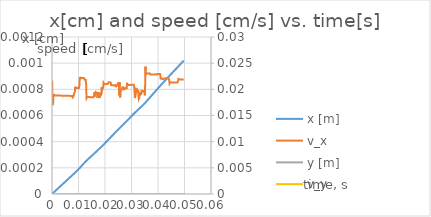
| Category | x [m] |
|---|---|
| 0.0 | 0 |
| 5e-05 | 0 |
| 0.0001 | 0 |
| 0.00015000000000000001 | 0 |
| 0.0002 | 0 |
| 0.00025 | 0 |
| 0.00030000000000000003 | 0 |
| 0.00035000000000000005 | 0 |
| 0.0004000000000000001 | 0 |
| 0.0004500000000000001 | 0 |
| 0.0005000000000000001 | 0 |
| 0.0005500000000000001 | 0 |
| 0.0006000000000000002 | 0 |
| 0.0006500000000000002 | 0 |
| 0.0007000000000000002 | 0 |
| 0.0007500000000000002 | 0 |
| 0.0008000000000000003 | 0 |
| 0.0008500000000000003 | 0 |
| 0.0009000000000000003 | 0 |
| 0.0009500000000000003 | 0 |
| 0.0010000000000000002 | 0 |
| 0.0010500000000000002 | 0 |
| 0.0011 | 0 |
| 0.00115 | 0 |
| 0.0012 | 0 |
| 0.0012499999999999998 | 0 |
| 0.0012999999999999997 | 0 |
| 0.0013499999999999996 | 0 |
| 0.0013999999999999996 | 0 |
| 0.0014499999999999995 | 0 |
| 0.0014999999999999994 | 0 |
| 0.0015499999999999993 | 0 |
| 0.0015999999999999992 | 0 |
| 0.0016499999999999991 | 0 |
| 0.001699999999999999 | 0 |
| 0.001749999999999999 | 0 |
| 0.0017999999999999989 | 0 |
| 0.0018499999999999988 | 0 |
| 0.0018999999999999987 | 0 |
| 0.0019499999999999986 | 0 |
| 0.0019999999999999987 | 0 |
| 0.002049999999999999 | 0 |
| 0.002099999999999999 | 0 |
| 0.002149999999999999 | 0 |
| 0.0021999999999999993 | 0 |
| 0.0022499999999999994 | 0 |
| 0.0022999999999999995 | 0 |
| 0.0023499999999999997 | 0 |
| 0.0024 | 0 |
| 0.00245 | 0 |
| 0.0025 | 0 |
| 0.00255 | 0 |
| 0.0026000000000000003 | 0 |
| 0.0026500000000000004 | 0 |
| 0.0027000000000000006 | 0 |
| 0.0027500000000000007 | 0 |
| 0.002800000000000001 | 0 |
| 0.002850000000000001 | 0 |
| 0.002900000000000001 | 0 |
| 0.0029500000000000012 | 0 |
| 0.0030000000000000014 | 0 |
| 0.0030500000000000015 | 0 |
| 0.0031000000000000016 | 0 |
| 0.0031500000000000018 | 0 |
| 0.003200000000000002 | 0 |
| 0.003250000000000002 | 0 |
| 0.003300000000000002 | 0 |
| 0.0033500000000000023 | 0 |
| 0.0034000000000000024 | 0 |
| 0.0034500000000000025 | 0 |
| 0.0035000000000000027 | 0 |
| 0.003550000000000003 | 0 |
| 0.003600000000000003 | 0 |
| 0.003650000000000003 | 0 |
| 0.003700000000000003 | 0 |
| 0.0037500000000000033 | 0 |
| 0.0038000000000000035 | 0 |
| 0.0038500000000000036 | 0 |
| 0.0039000000000000037 | 0 |
| 0.003950000000000004 | 0 |
| 0.0040000000000000036 | 0 |
| 0.004050000000000003 | 0 |
| 0.004100000000000003 | 0 |
| 0.004150000000000003 | 0 |
| 0.004200000000000002 | 0 |
| 0.004250000000000002 | 0 |
| 0.004300000000000002 | 0 |
| 0.0043500000000000014 | 0 |
| 0.004400000000000001 | 0 |
| 0.004450000000000001 | 0 |
| 0.0045000000000000005 | 0 |
| 0.00455 | 0 |
| 0.0046 | 0 |
| 0.00465 | 0 |
| 0.004699999999999999 | 0 |
| 0.004749999999999999 | 0 |
| 0.004799999999999999 | 0 |
| 0.004849999999999998 | 0 |
| 0.004899999999999998 | 0 |
| 0.004949999999999998 | 0 |
| 0.0049999999999999975 | 0 |
| 0.005049999999999997 | 0 |
| 0.005099999999999997 | 0 |
| 0.005149999999999997 | 0 |
| 0.005199999999999996 | 0 |
| 0.005249999999999996 | 0 |
| 0.005299999999999996 | 0 |
| 0.005349999999999995 | 0 |
| 0.005399999999999995 | 0 |
| 0.005449999999999995 | 0 |
| 0.0054999999999999945 | 0 |
| 0.005549999999999994 | 0 |
| 0.005599999999999994 | 0 |
| 0.005649999999999994 | 0 |
| 0.005699999999999993 | 0 |
| 0.005749999999999993 | 0 |
| 0.005799999999999993 | 0 |
| 0.005849999999999992 | 0 |
| 0.005899999999999992 | 0 |
| 0.005949999999999992 | 0 |
| 0.0059999999999999915 | 0 |
| 0.006049999999999991 | 0 |
| 0.006099999999999991 | 0 |
| 0.0061499999999999905 | 0 |
| 0.00619999999999999 | 0 |
| 0.00624999999999999 | 0 |
| 0.00629999999999999 | 0 |
| 0.006349999999999989 | 0 |
| 0.006399999999999989 | 0 |
| 0.006449999999999989 | 0 |
| 0.006499999999999988 | 0 |
| 0.006549999999999988 | 0 |
| 0.006599999999999988 | 0 |
| 0.0066499999999999875 | 0 |
| 0.006699999999999987 | 0 |
| 0.006749999999999987 | 0 |
| 0.006799999999999987 | 0 |
| 0.006849999999999986 | 0 |
| 0.006899999999999986 | 0 |
| 0.006949999999999986 | 0 |
| 0.006999999999999985 | 0 |
| 0.007049999999999985 | 0 |
| 0.007099999999999985 | 0 |
| 0.0071499999999999845 | 0 |
| 0.007199999999999984 | 0 |
| 0.007249999999999984 | 0 |
| 0.007299999999999984 | 0 |
| 0.007349999999999983 | 0 |
| 0.007399999999999983 | 0 |
| 0.007449999999999983 | 0 |
| 0.007499999999999982 | 0 |
| 0.007549999999999982 | 0 |
| 0.007599999999999982 | 0 |
| 0.0076499999999999815 | 0 |
| 0.007699999999999981 | 0 |
| 0.007749999999999981 | 0 |
| 0.0077999999999999806 | 0 |
| 0.00784999999999998 | 0 |
| 0.00789999999999998 | 0 |
| 0.00794999999999998 | 0 |
| 0.00799999999999998 | 0 |
| 0.008049999999999979 | 0 |
| 0.008099999999999979 | 0 |
| 0.008149999999999978 | 0 |
| 0.008199999999999978 | 0 |
| 0.008249999999999978 | 0 |
| 0.008299999999999978 | 0 |
| 0.008349999999999977 | 0 |
| 0.008399999999999977 | 0 |
| 0.008449999999999977 | 0 |
| 0.008499999999999976 | 0 |
| 0.008549999999999976 | 0 |
| 0.008599999999999976 | 0 |
| 0.008649999999999975 | 0 |
| 0.008699999999999975 | 0 |
| 0.008749999999999975 | 0 |
| 0.008799999999999975 | 0 |
| 0.008849999999999974 | 0 |
| 0.008899999999999974 | 0 |
| 0.008949999999999974 | 0 |
| 0.008999999999999973 | 0 |
| 0.009049999999999973 | 0 |
| 0.009099999999999973 | 0 |
| 0.009149999999999972 | 0 |
| 0.009199999999999972 | 0 |
| 0.009249999999999972 | 0 |
| 0.009299999999999971 | 0 |
| 0.009349999999999971 | 0 |
| 0.009399999999999971 | 0 |
| 0.00944999999999997 | 0 |
| 0.00949999999999997 | 0 |
| 0.00954999999999997 | 0 |
| 0.00959999999999997 | 0 |
| 0.00964999999999997 | 0 |
| 0.009699999999999969 | 0 |
| 0.009749999999999969 | 0 |
| 0.009799999999999968 | 0 |
| 0.009849999999999968 | 0 |
| 0.009899999999999968 | 0 |
| 0.009949999999999968 | 0 |
| 0.009999999999999967 | 0 |
| 0.010049999999999967 | 0 |
| 0.010099999999999967 | 0 |
| 0.010149999999999966 | 0 |
| 0.010199999999999966 | 0 |
| 0.010249999999999966 | 0 |
| 0.010299999999999965 | 0 |
| 0.010349999999999965 | 0 |
| 0.010399999999999965 | 0 |
| 0.010449999999999965 | 0 |
| 0.010499999999999964 | 0 |
| 0.010549999999999964 | 0 |
| 0.010599999999999964 | 0 |
| 0.010649999999999963 | 0 |
| 0.010699999999999963 | 0 |
| 0.010749999999999963 | 0 |
| 0.010799999999999962 | 0 |
| 0.010849999999999962 | 0 |
| 0.010899999999999962 | 0 |
| 0.010949999999999962 | 0 |
| 0.010999999999999961 | 0 |
| 0.011049999999999961 | 0 |
| 0.01109999999999996 | 0 |
| 0.01114999999999996 | 0 |
| 0.01119999999999996 | 0 |
| 0.01124999999999996 | 0 |
| 0.01129999999999996 | 0 |
| 0.011349999999999959 | 0 |
| 0.011399999999999959 | 0 |
| 0.011449999999999958 | 0 |
| 0.011499999999999958 | 0 |
| 0.011549999999999958 | 0 |
| 0.011599999999999958 | 0 |
| 0.011649999999999957 | 0 |
| 0.011699999999999957 | 0 |
| 0.011749999999999957 | 0 |
| 0.011799999999999956 | 0 |
| 0.011849999999999956 | 0 |
| 0.011899999999999956 | 0 |
| 0.011949999999999955 | 0 |
| 0.011999999999999955 | 0 |
| 0.012049999999999955 | 0 |
| 0.012099999999999955 | 0 |
| 0.012149999999999954 | 0 |
| 0.012199999999999954 | 0 |
| 0.012249999999999954 | 0 |
| 0.012299999999999953 | 0 |
| 0.012349999999999953 | 0 |
| 0.012399999999999953 | 0 |
| 0.012449999999999952 | 0 |
| 0.012499999999999952 | 0 |
| 0.012549999999999952 | 0 |
| 0.012599999999999952 | 0 |
| 0.012649999999999951 | 0 |
| 0.012699999999999951 | 0 |
| 0.01274999999999995 | 0 |
| 0.01279999999999995 | 0 |
| 0.01284999999999995 | 0 |
| 0.01289999999999995 | 0 |
| 0.01294999999999995 | 0 |
| 0.012999999999999949 | 0 |
| 0.013049999999999949 | 0 |
| 0.013099999999999948 | 0 |
| 0.013149999999999948 | 0 |
| 0.013199999999999948 | 0 |
| 0.013249999999999948 | 0 |
| 0.013299999999999947 | 0 |
| 0.013349999999999947 | 0 |
| 0.013399999999999947 | 0 |
| 0.013449999999999946 | 0 |
| 0.013499999999999946 | 0 |
| 0.013549999999999946 | 0 |
| 0.013599999999999945 | 0 |
| 0.013649999999999945 | 0 |
| 0.013699999999999945 | 0 |
| 0.013749999999999945 | 0 |
| 0.013799999999999944 | 0 |
| 0.013849999999999944 | 0 |
| 0.013899999999999944 | 0 |
| 0.013949999999999943 | 0 |
| 0.013999999999999943 | 0 |
| 0.014049999999999943 | 0 |
| 0.014099999999999942 | 0 |
| 0.014149999999999942 | 0 |
| 0.014199999999999942 | 0 |
| 0.014249999999999942 | 0 |
| 0.014299999999999941 | 0 |
| 0.014349999999999941 | 0 |
| 0.01439999999999994 | 0 |
| 0.01444999999999994 | 0 |
| 0.01449999999999994 | 0 |
| 0.01454999999999994 | 0 |
| 0.01459999999999994 | 0 |
| 0.014649999999999939 | 0 |
| 0.014699999999999939 | 0 |
| 0.014749999999999939 | 0 |
| 0.014799999999999938 | 0 |
| 0.014849999999999938 | 0 |
| 0.014899999999999938 | 0 |
| 0.014949999999999937 | 0 |
| 0.014999999999999937 | 0 |
| 0.015049999999999937 | 0 |
| 0.015099999999999936 | 0 |
| 0.015149999999999936 | 0 |
| 0.015199999999999936 | 0 |
| 0.015249999999999935 | 0 |
| 0.015299999999999935 | 0 |
| 0.015349999999999935 | 0 |
| 0.015399999999999935 | 0 |
| 0.015449999999999934 | 0 |
| 0.015499999999999934 | 0 |
| 0.015549999999999934 | 0 |
| 0.015599999999999933 | 0 |
| 0.015649999999999935 | 0 |
| 0.015699999999999936 | 0 |
| 0.015749999999999938 | 0 |
| 0.01579999999999994 | 0 |
| 0.01584999999999994 | 0 |
| 0.015899999999999942 | 0 |
| 0.015949999999999943 | 0 |
| 0.015999999999999945 | 0 |
| 0.016049999999999946 | 0 |
| 0.016099999999999948 | 0 |
| 0.01614999999999995 | 0 |
| 0.01619999999999995 | 0 |
| 0.016249999999999952 | 0 |
| 0.016299999999999953 | 0 |
| 0.016349999999999955 | 0 |
| 0.016399999999999956 | 0 |
| 0.016449999999999958 | 0 |
| 0.01649999999999996 | 0 |
| 0.01654999999999996 | 0 |
| 0.016599999999999962 | 0 |
| 0.016649999999999963 | 0 |
| 0.016699999999999965 | 0 |
| 0.016749999999999966 | 0 |
| 0.016799999999999968 | 0 |
| 0.01684999999999997 | 0 |
| 0.01689999999999997 | 0 |
| 0.016949999999999972 | 0 |
| 0.016999999999999973 | 0 |
| 0.017049999999999975 | 0 |
| 0.017099999999999976 | 0 |
| 0.017149999999999978 | 0 |
| 0.01719999999999998 | 0 |
| 0.01724999999999998 | 0 |
| 0.017299999999999982 | 0 |
| 0.017349999999999983 | 0 |
| 0.017399999999999985 | 0 |
| 0.017449999999999986 | 0 |
| 0.017499999999999988 | 0 |
| 0.01754999999999999 | 0 |
| 0.01759999999999999 | 0 |
| 0.017649999999999992 | 0 |
| 0.017699999999999994 | 0 |
| 0.017749999999999995 | 0 |
| 0.017799999999999996 | 0 |
| 0.017849999999999998 | 0 |
| 0.0179 | 0 |
| 0.01795 | 0 |
| 0.018000000000000002 | 0 |
| 0.018050000000000004 | 0 |
| 0.018100000000000005 | 0 |
| 0.018150000000000006 | 0 |
| 0.018200000000000008 | 0 |
| 0.01825000000000001 | 0 |
| 0.01830000000000001 | 0 |
| 0.018350000000000012 | 0 |
| 0.018400000000000014 | 0 |
| 0.018450000000000015 | 0 |
| 0.018500000000000016 | 0 |
| 0.018550000000000018 | 0 |
| 0.01860000000000002 | 0 |
| 0.01865000000000002 | 0 |
| 0.018700000000000022 | 0 |
| 0.018750000000000024 | 0 |
| 0.018800000000000025 | 0 |
| 0.018850000000000026 | 0 |
| 0.018900000000000028 | 0 |
| 0.01895000000000003 | 0 |
| 0.01900000000000003 | 0 |
| 0.019050000000000032 | 0 |
| 0.019100000000000034 | 0 |
| 0.019150000000000035 | 0 |
| 0.019200000000000036 | 0 |
| 0.019250000000000038 | 0 |
| 0.01930000000000004 | 0 |
| 0.01935000000000004 | 0 |
| 0.019400000000000042 | 0 |
| 0.019450000000000044 | 0 |
| 0.019500000000000045 | 0 |
| 0.019550000000000047 | 0 |
| 0.019600000000000048 | 0 |
| 0.01965000000000005 | 0 |
| 0.01970000000000005 | 0 |
| 0.019750000000000052 | 0 |
| 0.019800000000000054 | 0 |
| 0.019850000000000055 | 0 |
| 0.019900000000000057 | 0 |
| 0.019950000000000058 | 0 |
| 0.02000000000000006 | 0 |
| 0.02005000000000006 | 0 |
| 0.020100000000000062 | 0 |
| 0.020150000000000064 | 0 |
| 0.020200000000000065 | 0 |
| 0.020250000000000067 | 0 |
| 0.020300000000000068 | 0 |
| 0.02035000000000007 | 0 |
| 0.02040000000000007 | 0 |
| 0.020450000000000072 | 0 |
| 0.020500000000000074 | 0 |
| 0.020550000000000075 | 0 |
| 0.020600000000000077 | 0 |
| 0.020650000000000078 | 0 |
| 0.02070000000000008 | 0 |
| 0.02075000000000008 | 0 |
| 0.020800000000000082 | 0 |
| 0.020850000000000084 | 0 |
| 0.020900000000000085 | 0 |
| 0.020950000000000087 | 0 |
| 0.021000000000000088 | 0 |
| 0.02105000000000009 | 0 |
| 0.02110000000000009 | 0 |
| 0.021150000000000092 | 0 |
| 0.021200000000000094 | 0 |
| 0.021250000000000095 | 0 |
| 0.021300000000000097 | 0 |
| 0.021350000000000098 | 0 |
| 0.0214000000000001 | 0 |
| 0.0214500000000001 | 0 |
| 0.021500000000000102 | 0 |
| 0.021550000000000104 | 0 |
| 0.021600000000000105 | 0 |
| 0.021650000000000107 | 0 |
| 0.021700000000000108 | 0 |
| 0.02175000000000011 | 0 |
| 0.02180000000000011 | 0 |
| 0.021850000000000112 | 0 |
| 0.021900000000000114 | 0 |
| 0.021950000000000115 | 0 |
| 0.022000000000000117 | 0 |
| 0.022050000000000118 | 0 |
| 0.02210000000000012 | 0 |
| 0.02215000000000012 | 0 |
| 0.022200000000000122 | 0 |
| 0.022250000000000124 | 0 |
| 0.022300000000000125 | 0 |
| 0.022350000000000127 | 0 |
| 0.022400000000000128 | 0 |
| 0.02245000000000013 | 0 |
| 0.02250000000000013 | 0 |
| 0.022550000000000132 | 0 |
| 0.022600000000000134 | 0 |
| 0.022650000000000135 | 0 |
| 0.022700000000000137 | 0 |
| 0.022750000000000138 | 0 |
| 0.02280000000000014 | 0 |
| 0.02285000000000014 | 0 |
| 0.022900000000000142 | 0 |
| 0.022950000000000144 | 0 |
| 0.023000000000000145 | 0 |
| 0.023050000000000147 | 0 |
| 0.023100000000000148 | 0 |
| 0.02315000000000015 | 0 |
| 0.02320000000000015 | 0 |
| 0.023250000000000152 | 0 |
| 0.023300000000000154 | 0 |
| 0.023350000000000155 | 0 |
| 0.023400000000000157 | 0 |
| 0.023450000000000158 | 0 |
| 0.02350000000000016 | 0 |
| 0.02355000000000016 | 0 |
| 0.023600000000000163 | 0 |
| 0.023650000000000164 | 0 |
| 0.023700000000000165 | 0 |
| 0.023750000000000167 | 0 |
| 0.023800000000000168 | 0 |
| 0.02385000000000017 | 0 |
| 0.02390000000000017 | 0 |
| 0.023950000000000173 | 0 |
| 0.024000000000000174 | 0 |
| 0.024050000000000175 | 0 |
| 0.024100000000000177 | 0 |
| 0.02415000000000018 | 0 |
| 0.02420000000000018 | 0 |
| 0.02425000000000018 | 0 |
| 0.024300000000000183 | 0 |
| 0.024350000000000184 | 0 |
| 0.024400000000000185 | 0 |
| 0.024450000000000187 | 0 |
| 0.02450000000000019 | 0 |
| 0.02455000000000019 | 0 |
| 0.02460000000000019 | 0 |
| 0.024650000000000193 | 0 |
| 0.024700000000000194 | 0 |
| 0.024750000000000195 | 0 |
| 0.024800000000000197 | 0 |
| 0.0248500000000002 | 0 |
| 0.0249000000000002 | 0 |
| 0.0249500000000002 | 0 |
| 0.025000000000000203 | 0 |
| 0.025050000000000204 | 0 |
| 0.025100000000000205 | 0 |
| 0.025150000000000207 | 0 |
| 0.02520000000000021 | 0 |
| 0.02525000000000021 | 0 |
| 0.02530000000000021 | 0 |
| 0.025350000000000213 | 0.001 |
| 0.025400000000000214 | 0.001 |
| 0.025450000000000216 | 0.001 |
| 0.025500000000000217 | 0.001 |
| 0.02555000000000022 | 0.001 |
| 0.02560000000000022 | 0.001 |
| 0.02565000000000022 | 0.001 |
| 0.025700000000000223 | 0.001 |
| 0.025750000000000224 | 0.001 |
| 0.025800000000000226 | 0.001 |
| 0.025850000000000227 | 0.001 |
| 0.02590000000000023 | 0.001 |
| 0.02595000000000023 | 0.001 |
| 0.02600000000000023 | 0.001 |
| 0.026050000000000233 | 0.001 |
| 0.026100000000000234 | 0.001 |
| 0.026150000000000236 | 0.001 |
| 0.026200000000000237 | 0.001 |
| 0.02625000000000024 | 0.001 |
| 0.02630000000000024 | 0.001 |
| 0.02635000000000024 | 0.001 |
| 0.026400000000000243 | 0.001 |
| 0.026450000000000244 | 0.001 |
| 0.026500000000000246 | 0.001 |
| 0.026550000000000247 | 0.001 |
| 0.02660000000000025 | 0.001 |
| 0.02665000000000025 | 0.001 |
| 0.02670000000000025 | 0.001 |
| 0.026750000000000253 | 0.001 |
| 0.026800000000000254 | 0.001 |
| 0.026850000000000256 | 0.001 |
| 0.026900000000000257 | 0.001 |
| 0.02695000000000026 | 0.001 |
| 0.02700000000000026 | 0.001 |
| 0.02705000000000026 | 0.001 |
| 0.027100000000000263 | 0.001 |
| 0.027150000000000264 | 0.001 |
| 0.027200000000000266 | 0.001 |
| 0.027250000000000267 | 0.001 |
| 0.02730000000000027 | 0.001 |
| 0.02735000000000027 | 0.001 |
| 0.02740000000000027 | 0.001 |
| 0.027450000000000273 | 0.001 |
| 0.027500000000000274 | 0.001 |
| 0.027550000000000276 | 0.001 |
| 0.027600000000000277 | 0.001 |
| 0.02765000000000028 | 0.001 |
| 0.02770000000000028 | 0.001 |
| 0.02775000000000028 | 0.001 |
| 0.027800000000000283 | 0.001 |
| 0.027850000000000284 | 0.001 |
| 0.027900000000000286 | 0.001 |
| 0.027950000000000287 | 0.001 |
| 0.02800000000000029 | 0.001 |
| 0.02805000000000029 | 0.001 |
| 0.02810000000000029 | 0.001 |
| 0.028150000000000293 | 0.001 |
| 0.028200000000000294 | 0.001 |
| 0.028250000000000296 | 0.001 |
| 0.028300000000000297 | 0.001 |
| 0.0283500000000003 | 0.001 |
| 0.0284000000000003 | 0.001 |
| 0.0284500000000003 | 0.001 |
| 0.028500000000000303 | 0.001 |
| 0.028550000000000304 | 0.001 |
| 0.028600000000000306 | 0.001 |
| 0.028650000000000307 | 0.001 |
| 0.02870000000000031 | 0.001 |
| 0.02875000000000031 | 0.001 |
| 0.02880000000000031 | 0.001 |
| 0.028850000000000313 | 0.001 |
| 0.028900000000000314 | 0.001 |
| 0.028950000000000316 | 0.001 |
| 0.029000000000000317 | 0.001 |
| 0.02905000000000032 | 0.001 |
| 0.02910000000000032 | 0.001 |
| 0.02915000000000032 | 0.001 |
| 0.029200000000000323 | 0.001 |
| 0.029250000000000324 | 0.001 |
| 0.029300000000000326 | 0.001 |
| 0.029350000000000327 | 0.001 |
| 0.02940000000000033 | 0.001 |
| 0.02945000000000033 | 0.001 |
| 0.02950000000000033 | 0.001 |
| 0.029550000000000333 | 0.001 |
| 0.029600000000000334 | 0.001 |
| 0.029650000000000336 | 0.001 |
| 0.029700000000000337 | 0.001 |
| 0.02975000000000034 | 0.001 |
| 0.02980000000000034 | 0.001 |
| 0.02985000000000034 | 0.001 |
| 0.029900000000000343 | 0.001 |
| 0.029950000000000344 | 0.001 |
| 0.030000000000000346 | 0.001 |
| 0.030050000000000347 | 0.001 |
| 0.03010000000000035 | 0.001 |
| 0.03015000000000035 | 0.001 |
| 0.03020000000000035 | 0.001 |
| 0.030250000000000353 | 0.001 |
| 0.030300000000000354 | 0.001 |
| 0.030350000000000356 | 0.001 |
| 0.030400000000000357 | 0.001 |
| 0.03045000000000036 | 0.001 |
| 0.03050000000000036 | 0.001 |
| 0.03055000000000036 | 0.001 |
| 0.030600000000000363 | 0.001 |
| 0.030650000000000364 | 0.001 |
| 0.030700000000000366 | 0.001 |
| 0.030750000000000367 | 0.001 |
| 0.03080000000000037 | 0.001 |
| 0.03085000000000037 | 0.001 |
| 0.03090000000000037 | 0.001 |
| 0.030950000000000373 | 0.001 |
| 0.031000000000000374 | 0.001 |
| 0.031050000000000376 | 0.001 |
| 0.031100000000000377 | 0.001 |
| 0.03115000000000038 | 0.001 |
| 0.03120000000000038 | 0.001 |
| 0.03125000000000038 | 0.001 |
| 0.03130000000000038 | 0.001 |
| 0.031350000000000385 | 0.001 |
| 0.031400000000000386 | 0.001 |
| 0.03145000000000039 | 0.001 |
| 0.03150000000000039 | 0.001 |
| 0.03155000000000039 | 0.001 |
| 0.03160000000000039 | 0.001 |
| 0.03165000000000039 | 0.001 |
| 0.031700000000000395 | 0.001 |
| 0.031750000000000396 | 0.001 |
| 0.0318000000000004 | 0.001 |
| 0.0318500000000004 | 0.001 |
| 0.0319000000000004 | 0.001 |
| 0.0319500000000004 | 0.001 |
| 0.0320000000000004 | 0.001 |
| 0.032050000000000405 | 0.001 |
| 0.032100000000000406 | 0.001 |
| 0.03215000000000041 | 0.001 |
| 0.03220000000000041 | 0.001 |
| 0.03225000000000041 | 0.001 |
| 0.03230000000000041 | 0.001 |
| 0.03235000000000041 | 0.001 |
| 0.032400000000000415 | 0.001 |
| 0.032450000000000416 | 0.001 |
| 0.03250000000000042 | 0.001 |
| 0.03255000000000042 | 0.001 |
| 0.03260000000000042 | 0.001 |
| 0.03265000000000042 | 0.001 |
| 0.03270000000000042 | 0.001 |
| 0.032750000000000425 | 0.001 |
| 0.032800000000000426 | 0.001 |
| 0.03285000000000043 | 0.001 |
| 0.03290000000000043 | 0.001 |
| 0.03295000000000043 | 0.001 |
| 0.03300000000000043 | 0.001 |
| 0.03305000000000043 | 0.001 |
| 0.033100000000000435 | 0.001 |
| 0.033150000000000436 | 0.001 |
| 0.03320000000000044 | 0.001 |
| 0.03325000000000044 | 0.001 |
| 0.03330000000000044 | 0.001 |
| 0.03335000000000044 | 0.001 |
| 0.03340000000000044 | 0.001 |
| 0.033450000000000445 | 0.001 |
| 0.033500000000000446 | 0.001 |
| 0.03355000000000045 | 0.001 |
| 0.03360000000000045 | 0.001 |
| 0.03365000000000045 | 0.001 |
| 0.03370000000000045 | 0.001 |
| 0.03375000000000045 | 0.001 |
| 0.033800000000000455 | 0.001 |
| 0.033850000000000456 | 0.001 |
| 0.03390000000000046 | 0.001 |
| 0.03395000000000046 | 0.001 |
| 0.03400000000000046 | 0.001 |
| 0.03405000000000046 | 0.001 |
| 0.03410000000000046 | 0.001 |
| 0.034150000000000465 | 0.001 |
| 0.034200000000000466 | 0.001 |
| 0.03425000000000047 | 0.001 |
| 0.03430000000000047 | 0.001 |
| 0.03435000000000047 | 0.001 |
| 0.03440000000000047 | 0.001 |
| 0.03445000000000047 | 0.001 |
| 0.034500000000000475 | 0.001 |
| 0.034550000000000476 | 0.001 |
| 0.03460000000000048 | 0.001 |
| 0.03465000000000048 | 0.001 |
| 0.03470000000000048 | 0.001 |
| 0.03475000000000048 | 0.001 |
| 0.03480000000000048 | 0.001 |
| 0.034850000000000485 | 0.001 |
| 0.034900000000000486 | 0.001 |
| 0.03495000000000049 | 0.001 |
| 0.03500000000000049 | 0.001 |
| 0.03505000000000049 | 0.001 |
| 0.03510000000000049 | 0.001 |
| 0.03515000000000049 | 0.001 |
| 0.035200000000000495 | 0.001 |
| 0.035250000000000496 | 0.001 |
| 0.0353000000000005 | 0.001 |
| 0.0353500000000005 | 0.001 |
| 0.0354000000000005 | 0.001 |
| 0.0354500000000005 | 0.001 |
| 0.0355000000000005 | 0.001 |
| 0.035550000000000505 | 0.001 |
| 0.035600000000000506 | 0.001 |
| 0.03565000000000051 | 0.001 |
| 0.03570000000000051 | 0.001 |
| 0.03575000000000051 | 0.001 |
| 0.03580000000000051 | 0.001 |
| 0.03585000000000051 | 0.001 |
| 0.035900000000000515 | 0.001 |
| 0.035950000000000516 | 0.001 |
| 0.03600000000000052 | 0.001 |
| 0.03605000000000052 | 0.001 |
| 0.03610000000000052 | 0.001 |
| 0.03615000000000052 | 0.001 |
| 0.03620000000000052 | 0.001 |
| 0.036250000000000525 | 0.001 |
| 0.036300000000000526 | 0.001 |
| 0.03635000000000053 | 0.001 |
| 0.03640000000000053 | 0.001 |
| 0.03645000000000053 | 0.001 |
| 0.03650000000000053 | 0.001 |
| 0.03655000000000053 | 0.001 |
| 0.036600000000000535 | 0.001 |
| 0.036650000000000536 | 0.001 |
| 0.03670000000000054 | 0.001 |
| 0.03675000000000054 | 0.001 |
| 0.03680000000000054 | 0.001 |
| 0.03685000000000054 | 0.001 |
| 0.036900000000000543 | 0.001 |
| 0.036950000000000545 | 0.001 |
| 0.037000000000000546 | 0.001 |
| 0.03705000000000055 | 0.001 |
| 0.03710000000000055 | 0.001 |
| 0.03715000000000055 | 0.001 |
| 0.03720000000000055 | 0.001 |
| 0.037250000000000554 | 0.001 |
| 0.037300000000000555 | 0.001 |
| 0.037350000000000556 | 0.001 |
| 0.03740000000000056 | 0.001 |
| 0.03745000000000056 | 0.001 |
| 0.03750000000000056 | 0.001 |
| 0.03755000000000056 | 0.001 |
| 0.037600000000000564 | 0.001 |
| 0.037650000000000565 | 0.001 |
| 0.037700000000000566 | 0.001 |
| 0.03775000000000057 | 0.001 |
| 0.03780000000000057 | 0.001 |
| 0.03785000000000057 | 0.001 |
| 0.03790000000000057 | 0.001 |
| 0.037950000000000574 | 0.001 |
| 0.038000000000000575 | 0.001 |
| 0.038050000000000576 | 0.001 |
| 0.03810000000000058 | 0.001 |
| 0.03815000000000058 | 0.001 |
| 0.03820000000000058 | 0.001 |
| 0.03825000000000058 | 0.001 |
| 0.038300000000000584 | 0.001 |
| 0.038350000000000585 | 0.001 |
| 0.038400000000000586 | 0.001 |
| 0.03845000000000059 | 0.001 |
| 0.03850000000000059 | 0.001 |
| 0.03855000000000059 | 0.001 |
| 0.03860000000000059 | 0.001 |
| 0.038650000000000594 | 0.001 |
| 0.038700000000000595 | 0.001 |
| 0.038750000000000596 | 0.001 |
| 0.0388000000000006 | 0.001 |
| 0.0388500000000006 | 0.001 |
| 0.0389000000000006 | 0.001 |
| 0.0389500000000006 | 0.001 |
| 0.039000000000000604 | 0.001 |
| 0.039050000000000605 | 0.001 |
| 0.039100000000000606 | 0.001 |
| 0.03915000000000061 | 0.001 |
| 0.03920000000000061 | 0.001 |
| 0.03925000000000061 | 0.001 |
| 0.03930000000000061 | 0.001 |
| 0.039350000000000614 | 0.001 |
| 0.039400000000000615 | 0.001 |
| 0.039450000000000617 | 0.001 |
| 0.03950000000000062 | 0.001 |
| 0.03955000000000062 | 0.001 |
| 0.03960000000000062 | 0.001 |
| 0.03965000000000062 | 0.001 |
| 0.039700000000000624 | 0.001 |
| 0.039750000000000625 | 0.001 |
| 0.03980000000000063 | 0.001 |
| 0.03985000000000063 | 0.001 |
| 0.03990000000000063 | 0.001 |
| 0.03995000000000063 | 0.001 |
| 0.04000000000000063 | 0.001 |
| 0.040050000000000634 | 0.001 |
| 0.040100000000000635 | 0.001 |
| 0.04015000000000064 | 0.001 |
| 0.04020000000000064 | 0.001 |
| 0.04025000000000064 | 0.001 |
| 0.04030000000000064 | 0.001 |
| 0.04035000000000064 | 0.001 |
| 0.040400000000000644 | 0.001 |
| 0.040450000000000645 | 0.001 |
| 0.04050000000000065 | 0.001 |
| 0.04055000000000065 | 0.001 |
| 0.04060000000000065 | 0.001 |
| 0.04065000000000065 | 0.001 |
| 0.04070000000000065 | 0.001 |
| 0.040750000000000654 | 0.001 |
| 0.040800000000000655 | 0.001 |
| 0.04085000000000066 | 0.001 |
| 0.04090000000000066 | 0.001 |
| 0.04095000000000066 | 0.001 |
| 0.04100000000000066 | 0.001 |
| 0.04105000000000066 | 0.001 |
| 0.041100000000000664 | 0.001 |
| 0.041150000000000665 | 0.001 |
| 0.04120000000000067 | 0.001 |
| 0.04125000000000067 | 0.001 |
| 0.04130000000000067 | 0.001 |
| 0.04135000000000067 | 0.001 |
| 0.04140000000000067 | 0.001 |
| 0.041450000000000674 | 0.001 |
| 0.041500000000000675 | 0.001 |
| 0.04155000000000068 | 0.001 |
| 0.04160000000000068 | 0.001 |
| 0.04165000000000068 | 0.001 |
| 0.04170000000000068 | 0.001 |
| 0.04175000000000068 | 0.001 |
| 0.041800000000000684 | 0.001 |
| 0.041850000000000685 | 0.001 |
| 0.04190000000000069 | 0.001 |
| 0.04195000000000069 | 0.001 |
| 0.04200000000000069 | 0.001 |
| 0.04205000000000069 | 0.001 |
| 0.04210000000000069 | 0.001 |
| 0.042150000000000694 | 0.001 |
| 0.042200000000000695 | 0.001 |
| 0.0422500000000007 | 0.001 |
| 0.0423000000000007 | 0.001 |
| 0.0423500000000007 | 0.001 |
| 0.0424000000000007 | 0.001 |
| 0.0424500000000007 | 0.001 |
| 0.042500000000000704 | 0.001 |
| 0.042550000000000705 | 0.001 |
| 0.04260000000000071 | 0.001 |
| 0.04265000000000071 | 0.001 |
| 0.04270000000000071 | 0.001 |
| 0.04275000000000071 | 0.001 |
| 0.04280000000000071 | 0.001 |
| 0.042850000000000714 | 0.001 |
| 0.042900000000000715 | 0.001 |
| 0.04295000000000072 | 0.001 |
| 0.04300000000000072 | 0.001 |
| 0.04305000000000072 | 0.001 |
| 0.04310000000000072 | 0.001 |
| 0.04315000000000072 | 0.001 |
| 0.043200000000000724 | 0.001 |
| 0.043250000000000725 | 0.001 |
| 0.04330000000000073 | 0.001 |
| 0.04335000000000073 | 0.001 |
| 0.04340000000000073 | 0.001 |
| 0.04345000000000073 | 0.001 |
| 0.04350000000000073 | 0.001 |
| 0.043550000000000734 | 0.001 |
| 0.043600000000000735 | 0.001 |
| 0.04365000000000074 | 0.001 |
| 0.04370000000000074 | 0.001 |
| 0.04375000000000074 | 0.001 |
| 0.04380000000000074 | 0.001 |
| 0.04385000000000074 | 0.001 |
| 0.043900000000000744 | 0.001 |
| 0.043950000000000745 | 0.001 |
| 0.04400000000000075 | 0.001 |
| 0.04405000000000075 | 0.001 |
| 0.04410000000000075 | 0.001 |
| 0.04415000000000075 | 0.001 |
| 0.04420000000000075 | 0.001 |
| 0.044250000000000754 | 0.001 |
| 0.044300000000000755 | 0.001 |
| 0.04435000000000076 | 0.001 |
| 0.04440000000000076 | 0.001 |
| 0.04445000000000076 | 0.001 |
| 0.04450000000000076 | 0.001 |
| 0.04455000000000076 | 0.001 |
| 0.044600000000000764 | 0.001 |
| 0.044650000000000765 | 0.001 |
| 0.04470000000000077 | 0.001 |
| 0.04475000000000077 | 0.001 |
| 0.04480000000000077 | 0.001 |
| 0.04485000000000077 | 0.001 |
| 0.04490000000000077 | 0.001 |
| 0.044950000000000774 | 0.001 |
| 0.045000000000000775 | 0.001 |
| 0.04505000000000078 | 0.001 |
| 0.04510000000000078 | 0.001 |
| 0.04515000000000078 | 0.001 |
| 0.04520000000000078 | 0.001 |
| 0.04525000000000078 | 0.001 |
| 0.045300000000000784 | 0.001 |
| 0.045350000000000786 | 0.001 |
| 0.04540000000000079 | 0.001 |
| 0.04545000000000079 | 0.001 |
| 0.04550000000000079 | 0.001 |
| 0.04555000000000079 | 0.001 |
| 0.04560000000000079 | 0.001 |
| 0.045650000000000794 | 0.001 |
| 0.045700000000000796 | 0.001 |
| 0.0457500000000008 | 0.001 |
| 0.0458000000000008 | 0.001 |
| 0.0458500000000008 | 0.001 |
| 0.0459000000000008 | 0.001 |
| 0.0459500000000008 | 0.001 |
| 0.046000000000000804 | 0.001 |
| 0.046050000000000806 | 0.001 |
| 0.04610000000000081 | 0.001 |
| 0.04615000000000081 | 0.001 |
| 0.04620000000000081 | 0.001 |
| 0.04625000000000081 | 0.001 |
| 0.04630000000000081 | 0.001 |
| 0.046350000000000814 | 0.001 |
| 0.046400000000000816 | 0.001 |
| 0.04645000000000082 | 0.001 |
| 0.04650000000000082 | 0.001 |
| 0.04655000000000082 | 0.001 |
| 0.04660000000000082 | 0.001 |
| 0.04665000000000082 | 0.001 |
| 0.046700000000000824 | 0.001 |
| 0.046750000000000826 | 0.001 |
| 0.04680000000000083 | 0.001 |
| 0.04685000000000083 | 0.001 |
| 0.04690000000000083 | 0.001 |
| 0.04695000000000083 | 0.001 |
| 0.04700000000000083 | 0.001 |
| 0.047050000000000834 | 0.001 |
| 0.047100000000000836 | 0.001 |
| 0.04715000000000084 | 0.001 |
| 0.04720000000000084 | 0.001 |
| 0.04725000000000084 | 0.001 |
| 0.04730000000000084 | 0.001 |
| 0.04735000000000084 | 0.001 |
| 0.047400000000000844 | 0.001 |
| 0.047450000000000846 | 0.001 |
| 0.04750000000000085 | 0.001 |
| 0.04755000000000085 | 0.001 |
| 0.04760000000000085 | 0.001 |
| 0.04765000000000085 | 0.001 |
| 0.04770000000000085 | 0.001 |
| 0.047750000000000854 | 0.001 |
| 0.047800000000000856 | 0.001 |
| 0.04785000000000086 | 0.001 |
| 0.04790000000000086 | 0.001 |
| 0.04795000000000086 | 0.001 |
| 0.04800000000000086 | 0.001 |
| 0.04805000000000086 | 0.001 |
| 0.048100000000000864 | 0.001 |
| 0.048150000000000866 | 0.001 |
| 0.04820000000000087 | 0.001 |
| 0.04825000000000087 | 0.001 |
| 0.04830000000000087 | 0.001 |
| 0.04835000000000087 | 0.001 |
| 0.04840000000000087 | 0.001 |
| 0.048450000000000874 | 0.001 |
| 0.048500000000000876 | 0.001 |
| 0.04855000000000088 | 0.001 |
| 0.04860000000000088 | 0.001 |
| 0.04865000000000088 | 0.001 |
| 0.04870000000000088 | 0.001 |
| 0.04875000000000088 | 0.001 |
| 0.048800000000000884 | 0.001 |
| 0.048850000000000886 | 0.001 |
| 0.04890000000000089 | 0.001 |
| 0.04895000000000089 | 0.001 |
| 0.04900000000000089 | 0.001 |
| 0.04905000000000089 | 0.001 |
| 0.04910000000000089 | 0.001 |
| 0.049150000000000894 | 0.001 |
| 0.049200000000000896 | 0.001 |
| 0.0492500000000009 | 0.001 |
| 0.0493000000000009 | 0.001 |
| 0.0493500000000009 | 0.001 |
| 0.0494000000000009 | 0.001 |
| 0.0494500000000009 | 0.001 |
| 0.049500000000000904 | 0.001 |
| 0.049550000000000906 | 0.001 |
| 0.04960000000000091 | 0.001 |
| 0.04965000000000091 | 0.001 |
| 0.04970000000000091 | 0.001 |
| 0.04975000000000091 | 0.001 |
| 0.04980000000000091 | 0.001 |
| 0.049850000000000914 | 0.001 |
| 0.049900000000000916 | 0.001 |
| 0.04995000000000092 | 0.001 |
| 0.05000000000000092 | 0.001 |